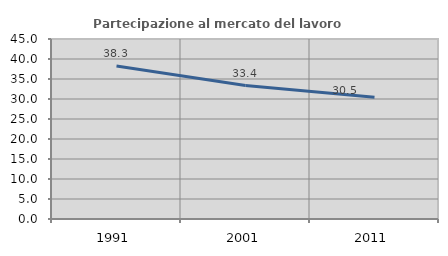
| Category | Partecipazione al mercato del lavoro  femminile |
|---|---|
| 1991.0 | 38.27 |
| 2001.0 | 33.372 |
| 2011.0 | 30.461 |